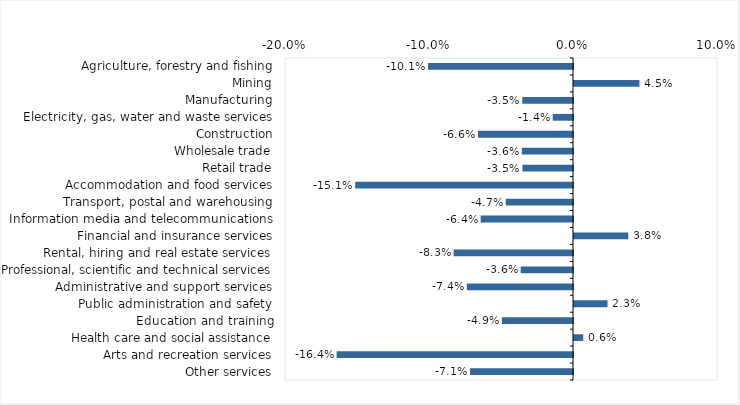
| Category | This week |
|---|---|
| Agriculture, forestry and fishing | -0.101 |
| Mining | 0.045 |
| Manufacturing | -0.035 |
| Electricity, gas, water and waste services | -0.014 |
| Construction | -0.066 |
| Wholesale trade | -0.036 |
| Retail trade | -0.035 |
| Accommodation and food services | -0.151 |
| Transport, postal and warehousing | -0.047 |
| Information media and telecommunications | -0.064 |
| Financial and insurance services | 0.038 |
| Rental, hiring and real estate services | -0.083 |
| Professional, scientific and technical services | -0.036 |
| Administrative and support services | -0.074 |
| Public administration and safety | 0.023 |
| Education and training | -0.049 |
| Health care and social assistance | 0.006 |
| Arts and recreation services | -0.164 |
| Other services | -0.071 |